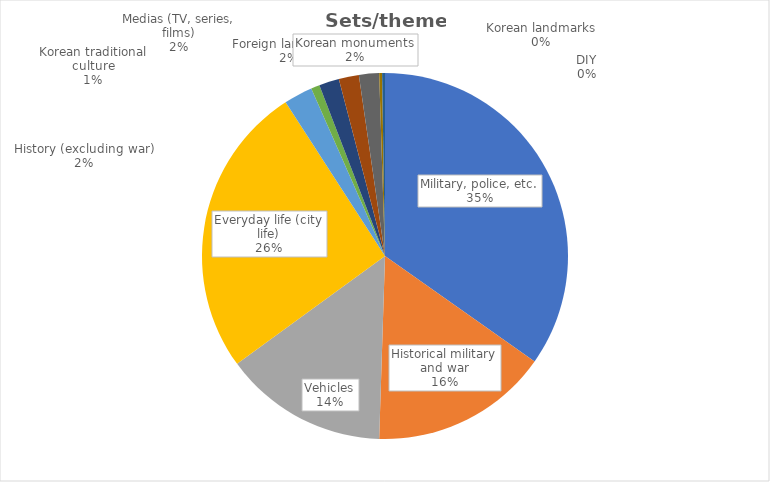
| Category | Series 0 |
|---|---|
| Military, police, etc. | 137 |
| Historical military and war | 62 |
| Vehicles | 57 |
| Everyday life (city life) | 102 |
| History (excluding war) | 10 |
| Korean traditional culture | 3 |
| Medias (TV, series, films) | 7 |
| Foreign landmarks | 7 |
| Korean monuments | 7 |
| Korean landmarks | 1 |
| DIY | 1 |